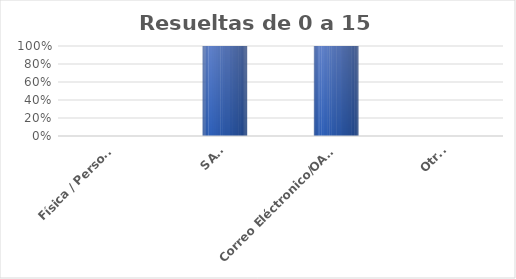
| Category | Series 0 |
|---|---|
| Física / Personal | 0 |
| SAIP | 2 |
| Correo Eléctronico/OAI/Info/Contacto | 1 |
| Otras | 0 |